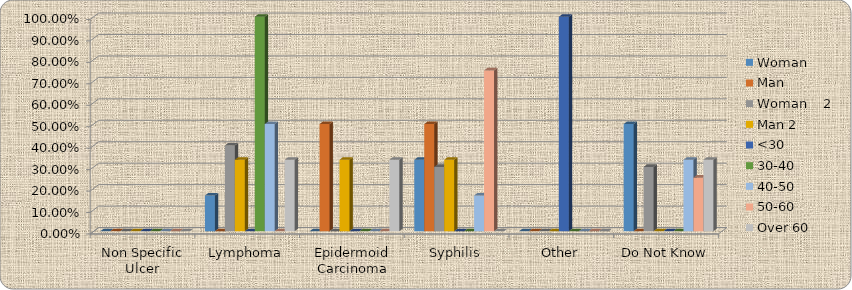
| Category | Woman     | Man  | Woman    2 | Man 2 | <30 | 30-40 | 40-50 | 50-60 | Over 60 |
|---|---|---|---|---|---|---|---|---|---|
| Non Specific Ulcer | 0 | 0 | 0 | 0 | 0 | 0 | 0 | 0 | 0 |
| Lymphoma | 0.167 | 0 | 0.4 | 0.333 | 0 | 1 | 0.5 | 0 | 0.333 |
| Epidermoid Carcinoma | 0 | 0.5 | 0 | 0.333 | 0 | 0 | 0 | 0 | 0.333 |
| Syphilis | 0.333 | 0.5 | 0.3 | 0.333 | 0 | 0 | 0.167 | 0.75 | 0 |
| Other | 0 | 0 | 0 | 0 | 1 | 0 | 0 | 0 | 0 |
| Do Not Know | 0.5 | 0 | 0.3 | 0 | 0 | 0 | 0.333 | 0.25 | 0.333 |